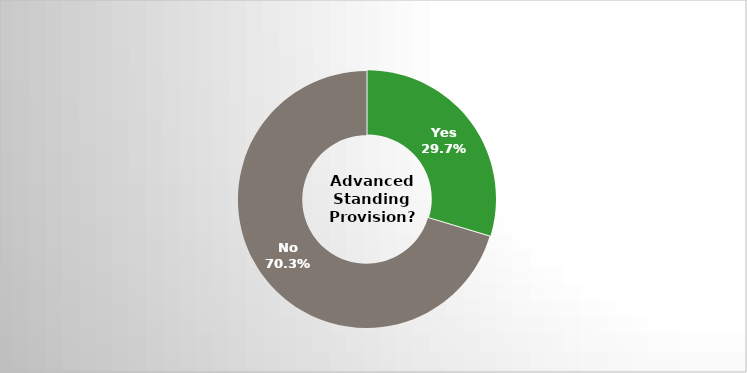
| Category | Series 0 |
|---|---|
| Yes | 0.297 |
| No | 0.703 |